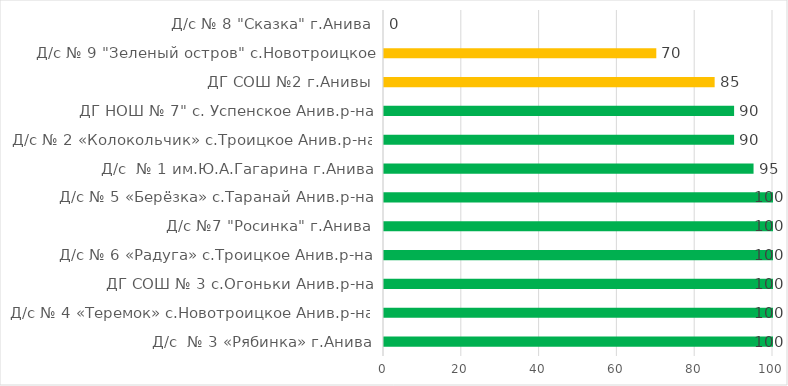
| Category | Series 0 |
|---|---|
| Д/с  № 3 «Рябинка» г.Анива | 100 |
| Д/с № 4 «Теремок» с.Новотроицкое Анив.р-на | 100 |
| ДГ СОШ № 3 с.Огоньки Анив.р-на | 100 |
| Д/с № 6 «Радуга» с.Троицкое Анив.р-на | 100 |
| Д/с №7 "Росинка" г.Анива | 100 |
| Д/с № 5 «Берёзка» с.Таранай Анив.р-на | 100 |
| Д/с  № 1 им.Ю.А.Гагарина г.Анива | 95 |
| Д/с № 2 «Колокольчик» с.Троицкое Анив.р-на | 90 |
| ДГ НОШ № 7" с. Успенское Анив.р-на | 90 |
| ДГ СОШ №2 г.Анивы | 85 |
| Д/с № 9 "Зеленый остров" с.Новотроицкое | 70 |
| Д/с № 8 "Сказка" г.Анива | 0 |